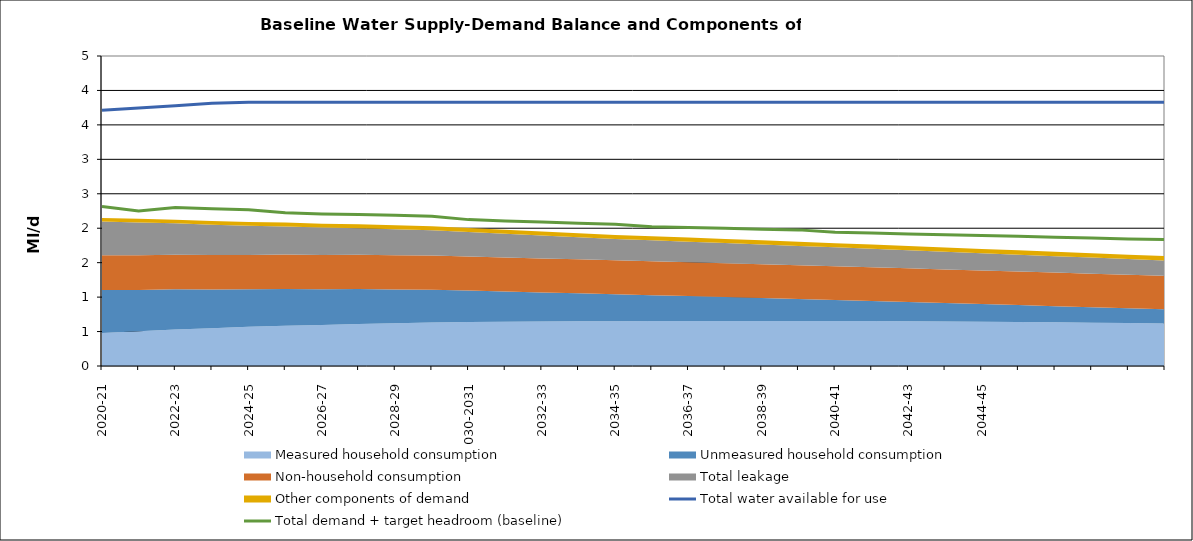
| Category | Total water available for use | Total demand + target headroom (baseline) |
|---|---|---|
| 0 | 3.714 | 2.315 |
| 1 | 3.746 | 2.251 |
| 2 | 3.779 | 2.299 |
| 3 | 3.813 | 2.284 |
| 4 | 3.83 | 2.268 |
| 5 | 3.83 | 2.225 |
| 6 | 3.83 | 2.207 |
| 7 | 3.83 | 2.201 |
| 8 | 3.83 | 2.188 |
| 9 | 3.83 | 2.174 |
| 10 | 3.83 | 2.125 |
| 11 | 3.83 | 2.106 |
| 12 | 3.83 | 2.09 |
| 13 | 3.83 | 2.074 |
| 14 | 3.83 | 2.057 |
| 15 | 3.83 | 2.022 |
| 16 | 3.83 | 2.01 |
| 17 | 3.83 | 1.999 |
| 18 | 3.83 | 1.986 |
| 19 | 3.83 | 1.976 |
| 20 | 3.83 | 1.941 |
| 21 | 3.83 | 1.93 |
| 22 | 3.83 | 1.916 |
| 23 | 3.83 | 1.906 |
| 24 | 3.83 | 1.894 |
| 25 | 3.83 | 1.882 |
| 26 | 3.83 | 1.87 |
| 27 | 3.83 | 1.859 |
| 28 | 3.83 | 1.844 |
| 29 | 3.83 | 1.835 |